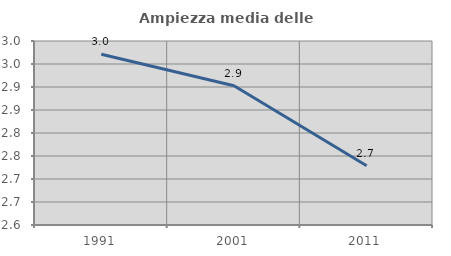
| Category | Ampiezza media delle famiglie |
|---|---|
| 1991.0 | 2.971 |
| 2001.0 | 2.903 |
| 2011.0 | 2.729 |